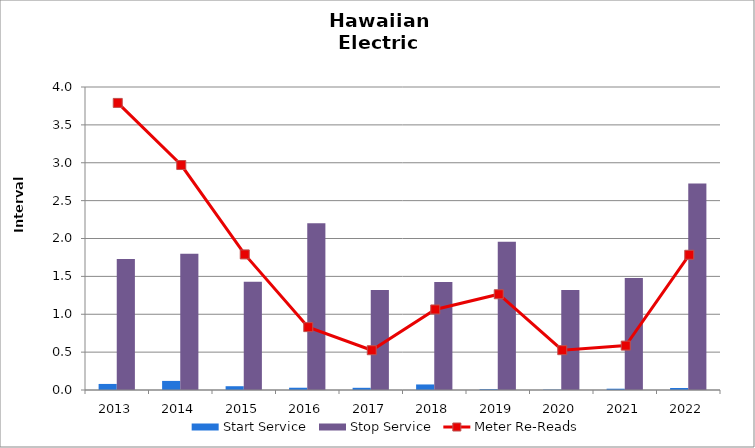
| Category | Start Service | Stop Service |
|---|---|---|
| 2013.0 | 0.08 | 1.73 |
| 2014.0 | 0.12 | 1.8 |
| 2015.0 | 0.05 | 1.43 |
| 2016.0 | 0.03 | 2.2 |
| 2017.0 | 0.029 | 1.32 |
| 2018.0 | 0.073 | 1.425 |
| 2019.0 | 0.011 | 1.956 |
| 2020.0 | 0.005 | 1.321 |
| 2021.0 | 0.017 | 1.477 |
| 2022.0 | 0.027 | 2.726 |